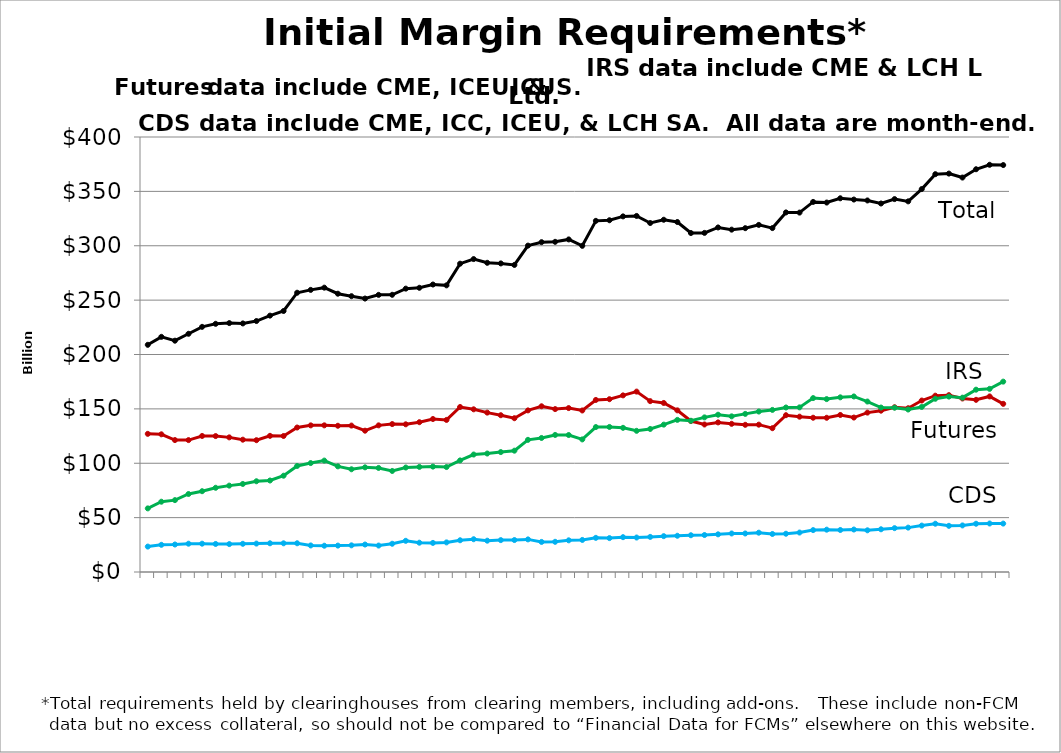
| Category | CDS | Futures | IRS | Total |
|---|---|---|---|---|
| nan |  |  |  |  |
| 2014-03-31 |  |  |  |  |
| nan |  |  |  |  |
| 2014-05-30 |  |  |  |  |
| nan |  |  |  |  |
| 2014-07-31 |  |  |  |  |
| nan |  |  |  |  |
| 2014-09-30 |  |  |  |  |
| nan |  |  |  |  |
| 2014-11-28 |  |  |  |  |
| nan |  |  |  |  |
| 2015-01-30 |  |  |  |  |
| nan |  |  |  |  |
| 2015-03-31 |  |  |  |  |
| nan |  |  |  |  |
| 2015-05-29 |  |  |  |  |
| nan |  |  |  |  |
| 2015-07-31 |  |  |  |  |
| nan |  |  |  |  |
| 2015-09-30 |  |  |  |  |
| nan |  |  |  |  |
| 2015-11-30 |  |  |  |  |
| nan |  |  |  |  |
| 2016-01-29 |  |  |  |  |
| nan |  |  |  |  |
| 2016-03-31 |  |  |  |  |
| nan |  |  |  |  |
| 2016-05-31 |  |  |  |  |
| nan |  |  |  |  |
| 2016-07-29 |  |  |  |  |
| nan |  |  |  |  |
| 2016-09-30 |  |  |  |  |
| nan |  |  |  |  |
| 2016-11-30 |  |  |  |  |
| nan |  |  |  |  |
| 2017-01-31 |  |  |  |  |
| nan |  |  |  |  |
| 2017-03-31 |  |  |  |  |
| nan |  |  |  |  |
| 2017-05-31 |  |  |  |  |
| nan |  |  |  |  |
| 2017-07-31 |  |  |  |  |
| nan |  |  |  |  |
| 2017-09-29 |  |  |  |  |
| nan |  |  |  |  |
| 2017-11-30 |  |  |  |  |
| nan |  |  |  |  |
| 2018-01-31 |  |  |  |  |
| nan |  |  |  |  |
| 2018-03-29 |  |  |  |  |
| nan |  |  |  |  |
| 2018-05-31 |  |  |  |  |
| nan |  |  |  |  |
| 2018-07-31 |  |  |  |  |
| nan |  |  |  |  |
| 2018-09-28 |  |  |  |  |
| nan |  |  |  |  |
| 2018-11-30 |  |  |  |  |
| nan |  |  |  |  |
| 2019-01-31 |  |  |  |  |
| nan |  |  |  |  |
| 2019-03-29 |  |  |  |  |
| nan |  |  |  |  |
| 2019-05-31 |  |  |  |  |